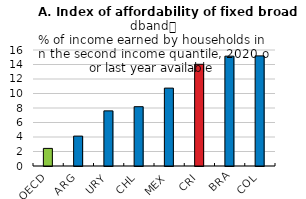
| Category | Series 0 |
|---|---|
| OECD | 2.427 |
| ARG | 4.124 |
| URY | 7.605 |
| CHL | 8.181 |
| MEX | 10.743 |
| CRI | 14.029 |
| BRA | 15.15 |
| COL | 15.188 |